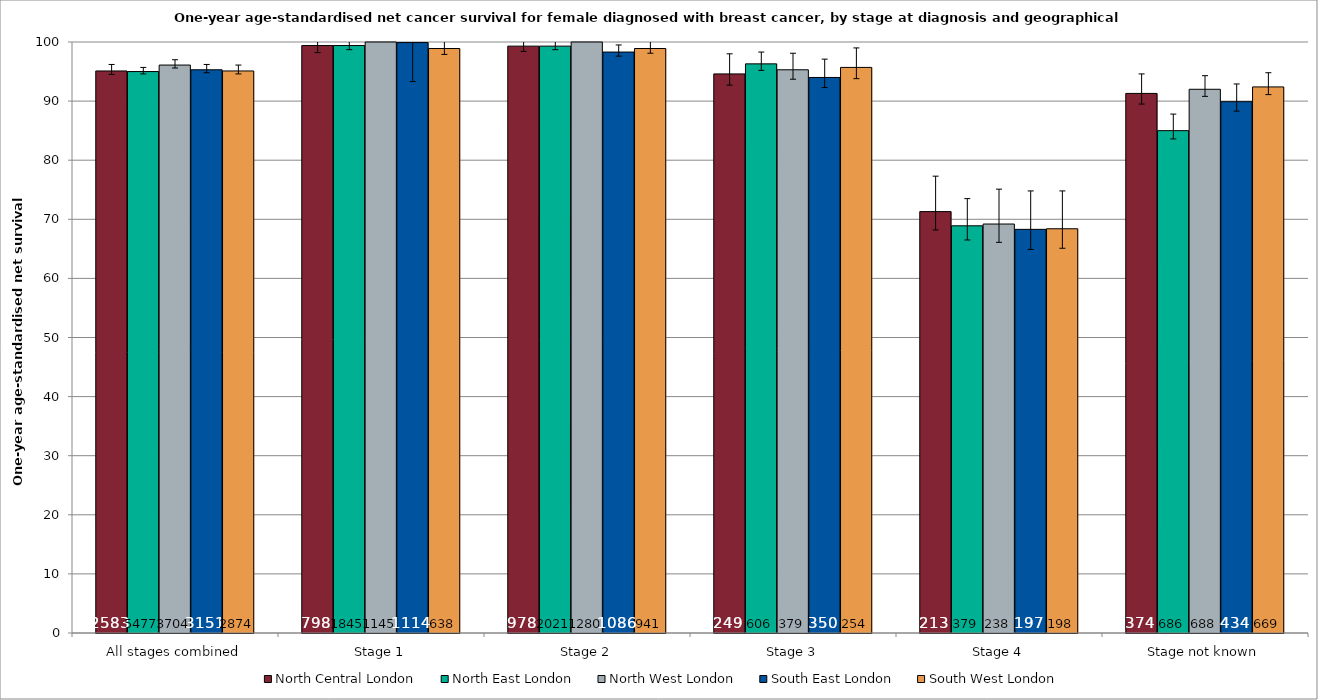
| Category | North Central London | North East London | North West London | South East London | South West London |
|---|---|---|---|---|---|
| All stages combined | 95.1 | 95 | 96.1 | 95.3 | 95.1 |
| Stage 1 | 99.4 | 99.4 | 100.3 | 99.9 | 98.9 |
| Stage 2 | 99.3 | 99.3 | 100.1 | 98.3 | 98.9 |
| Stage 3 | 94.6 | 96.3 | 95.3 | 94 | 95.7 |
| Stage 4 | 71.3 | 68.9 | 69.2 | 68.3 | 68.4 |
| Stage not known | 91.3 | 85 | 92 | 89.9 | 92.4 |